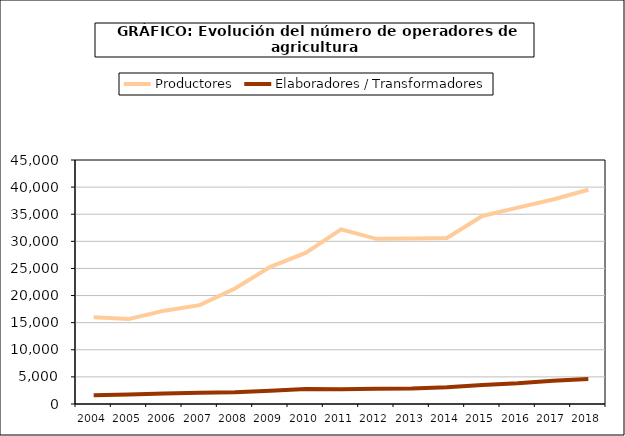
| Category | Productores | Elaboradores / Transformadores |
|---|---|---|
| 2004.0 | 16013 | 1635 |
| 2005.0 | 15693 | 1764 |
| 2006.0 | 17214 | 1942 |
| 2007.0 | 18226 | 2061 |
| 2008.0 | 21291 | 2168 |
| 2009.0 | 25291 | 2465 |
| 2010.0 | 27877 | 2747 |
| 2011.0 | 32206 | 2729 |
| 2012.0 | 30462 | 2790 |
| 2013.0 | 30502 | 2842 |
| 2014.0 | 30602 | 3082 |
| 2015.0 | 34673 | 3492 |
| 2016.0 | 36207 | 3810 |
| 2017.0 | 37712 | 4297 |
| 2018.0 | 39505 | 4627 |